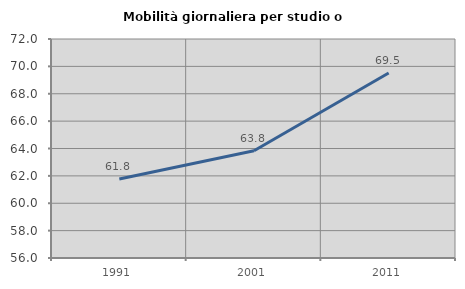
| Category | Mobilità giornaliera per studio o lavoro |
|---|---|
| 1991.0 | 61.777 |
| 2001.0 | 63.839 |
| 2011.0 | 69.521 |